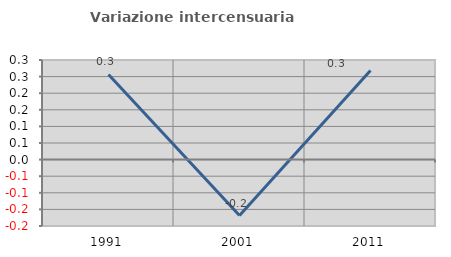
| Category | Variazione intercensuaria annua |
|---|---|
| 1991.0 | 0.256 |
| 2001.0 | -0.169 |
| 2011.0 | 0.268 |